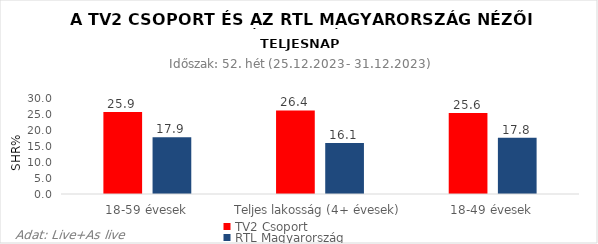
| Category | TV2 Csoport | RTL Magyarország |
|---|---|---|
| 18-59 évesek | 25.9 | 17.9 |
| Teljes lakosság (4+ évesek) | 26.4 | 16.1 |
| 18-49 évesek | 25.6 | 17.8 |